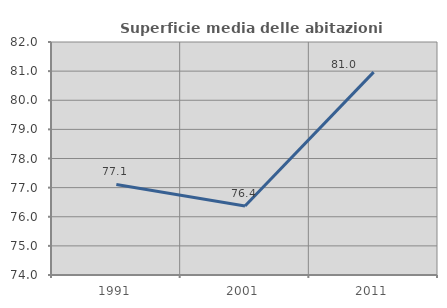
| Category | Superficie media delle abitazioni occupate |
|---|---|
| 1991.0 | 77.108 |
| 2001.0 | 76.368 |
| 2011.0 | 80.966 |